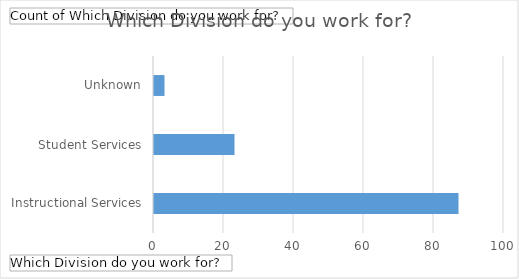
| Category | Total |
|---|---|
| Instructional Services | 87 |
| Student Services | 23 |
| Unknown | 3 |